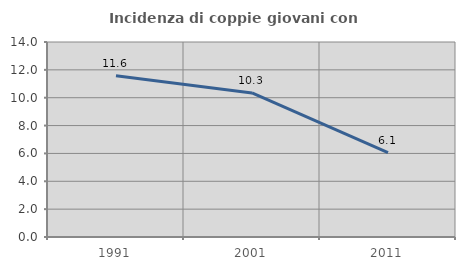
| Category | Incidenza di coppie giovani con figli |
|---|---|
| 1991.0 | 11.579 |
| 2001.0 | 10.345 |
| 2011.0 | 6.061 |